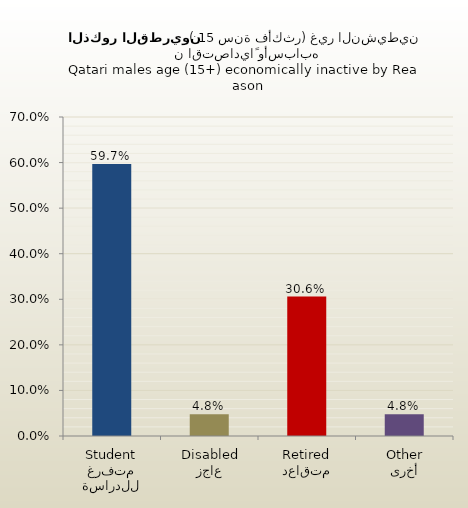
| Category | الذكور القطريين |
|---|---|
| متفرغ للدراسة
Student | 0.597 |
| عاجز
Disabled | 0.048 |
| متقاعد
Retired | 0.306 |
| أخرى
Other | 0.048 |